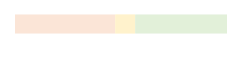
| Category | Series 0 | Series 1 | Series 2 |
|---|---|---|---|
| 0 | 0.708 | 0.142 | 0.65 |